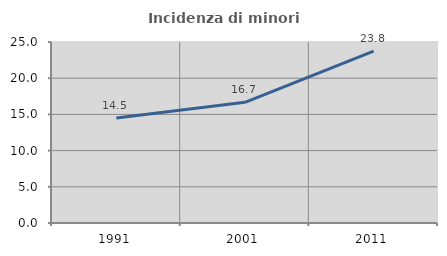
| Category | Incidenza di minori stranieri |
|---|---|
| 1991.0 | 14.493 |
| 2001.0 | 16.667 |
| 2011.0 | 23.75 |